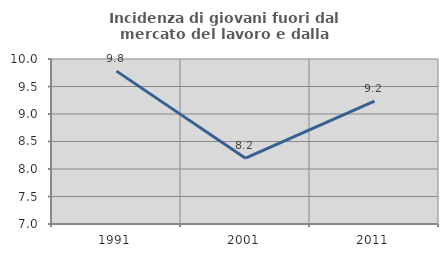
| Category | Incidenza di giovani fuori dal mercato del lavoro e dalla formazione  |
|---|---|
| 1991.0 | 9.779 |
| 2001.0 | 8.197 |
| 2011.0 | 9.235 |